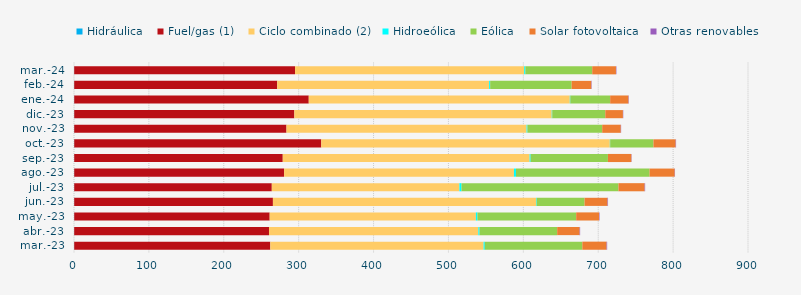
| Category | Hidráulica | Fuel/gas (1) | Ciclo combinado (2) | Hidroeólica | Eólica | Solar fotovoltaica | Otras renovables |
|---|---|---|---|---|---|---|---|
| mar.-23 | 0.282 | 261.841 | 284.831 | 1.572 | 130.237 | 32.429 | 0.738 |
| abr.-23 | 0.276 | 260.1 | 279.544 | 1.573 | 103.686 | 30.034 | 0.631 |
| may.-23 | 0.298 | 261.008 | 275.341 | 2.067 | 131.849 | 30.564 | 0.651 |
| jun.-23 | 0.284 | 265.329 | 351.459 | 0.809 | 63.875 | 30.692 | 0.665 |
| jul.-23 | 0.302 | 263.817 | 250.521 | 2.759 | 209.601 | 35.003 | 0.646 |
| ago.-23 | 0.29 | 280.25 | 306.931 | 2.7 | 178.402 | 33.602 | 0.375 |
| sep.-23 | 0.289 | 278.469 | 329.651 | 1.315 | 103.233 | 31.322 | 0.372 |
| oct.-23 | 0.303 | 329.853 | 385.374 | 0.443 | 57.759 | 29.7 | 0.524 |
| nov.-23 | 0.28 | 283.46 | 320.608 | 1.09 | 99.873 | 24.842 | 0.425 |
| dic.-23 | 0.306 | 293.933 | 343.705 | 0.669 | 70.816 | 23.549 | 0.445 |
| ene.-24 | 0.296 | 313.174 | 348.608 | 0.668 | 53.196 | 24.433 | 0.5 |
| feb.-24 | 0.285 | 271.078 | 282.957 | 1.415 | 108.752 | 26.307 | 0.499 |
| mar.-24 | 0.273 | 294.881 | 305.967 | 1.589 | 89.282 | 31.71 | 0.578 |